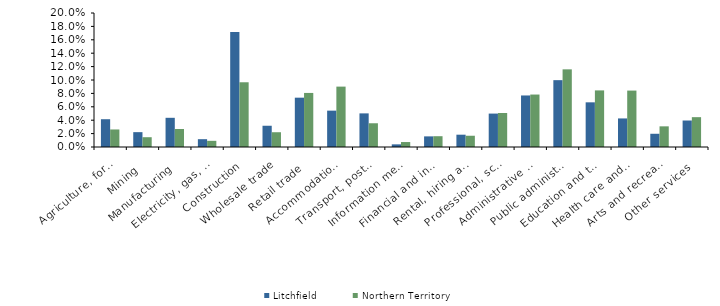
| Category | Litchfield | Northern Territory |
|---|---|---|
| Agriculture, forestry and fishing | 0.041 | 0.026 |
| Mining | 0.022 | 0.015 |
| Manufacturing | 0.044 | 0.027 |
| Electricity, gas, water and waste services | 0.012 | 0.009 |
| Construction | 0.172 | 0.097 |
| Wholesale trade | 0.032 | 0.022 |
| Retail trade | 0.074 | 0.081 |
| Accommodation and food services | 0.054 | 0.09 |
| Transport, postal and warehousing | 0.05 | 0.035 |
| Information media and telecommunications | 0.004 | 0.007 |
| Financial and insurance services | 0.016 | 0.016 |
| Rental, hiring and real estate services | 0.018 | 0.017 |
| Professional, scientific and technical services | 0.05 | 0.051 |
| Administrative and support services | 0.077 | 0.078 |
| Public administration and safety | 0.1 | 0.116 |
| Education and training | 0.067 | 0.084 |
| Health care and social assistance | 0.043 | 0.084 |
| Arts and recreation services | 0.02 | 0.031 |
| Other services | 0.04 | 0.045 |